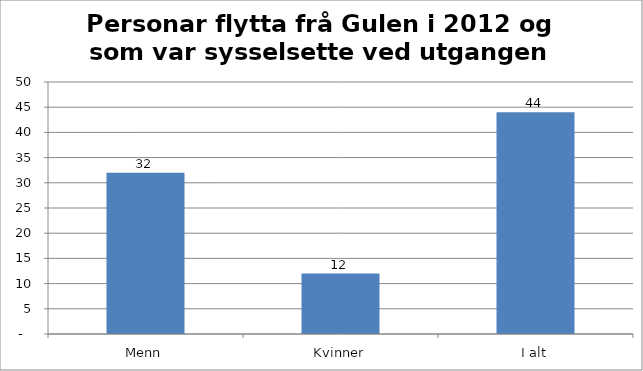
| Category | 1411 Gulen |
|---|---|
| Menn | 32 |
| Kvinner | 12 |
| I alt | 44 |